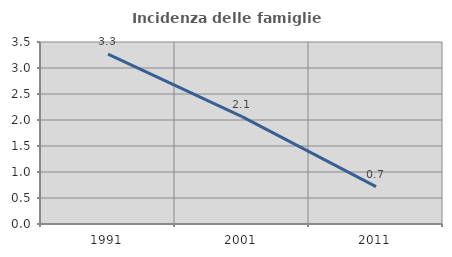
| Category | Incidenza delle famiglie numerose |
|---|---|
| 1991.0 | 3.268 |
| 2001.0 | 2.064 |
| 2011.0 | 0.719 |